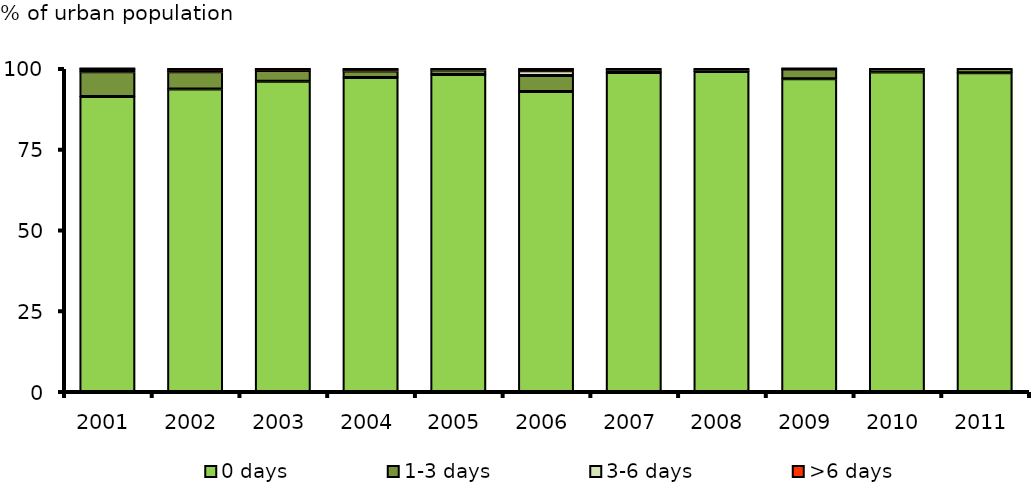
| Category | 0 days | 1-3 days | 3-6 days | >6 days |
|---|---|---|---|---|
| 2001.0 | 91.298 | 7.664 | 0.881 | 0.157 |
| 2002.0 | 93.651 | 5.338 | 0.648 | 0.363 |
| 2003.0 | 96.031 | 3.346 | 0.244 | 0.38 |
| 2004.0 | 97.23 | 1.992 | 0.404 | 0.374 |
| 2005.0 | 98.159 | 1.347 | 0.495 | 0 |
| 2006.0 | 92.903 | 4.935 | 1.486 | 0.676 |
| 2007.0 | 98.74 | 0.868 | 0.392 | 0 |
| 2008.0 | 99.097 | 0.553 | 0.35 | 0 |
| 2009.0 | 96.792 | 3.061 | 0 | 0.147 |
| 2010.0 | 98.903 | 1.097 | 0 | 0 |
| 2011.0 | 98.721 | 1.279 | 0 | 0 |